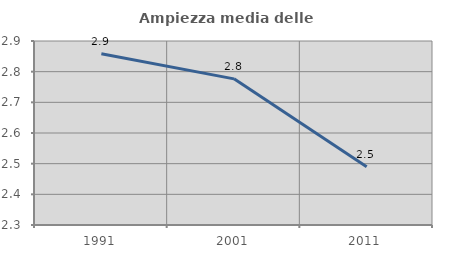
| Category | Ampiezza media delle famiglie |
|---|---|
| 1991.0 | 2.858 |
| 2001.0 | 2.777 |
| 2011.0 | 2.49 |